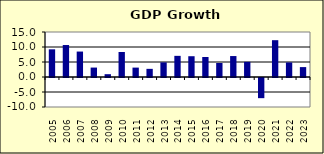
| Category | -0.3 |
|---|---|
| 2005.0 | 9.222 |
| 2006.0 | 10.657 |
| 2007.0 | 8.48 |
| 2008.0 | 3.144 |
| 2009.0 | 0.936 |
| 2010.0 | 8.34 |
| 2011.0 | 3.133 |
| 2012.0 | 2.717 |
| 2013.0 | 4.875 |
| 2014.0 | 7.05 |
| 2015.0 | 6.927 |
| 2016.0 | 6.659 |
| 2017.0 | 4.667 |
| 2018.0 | 6.983 |
| 2019.0 | 5.052 |
| 2020.0 | -6.72 |
| 2021.0 | 12.272 |
| 2022.0 | 4.858 |
| 2023.0 | 3.3 |